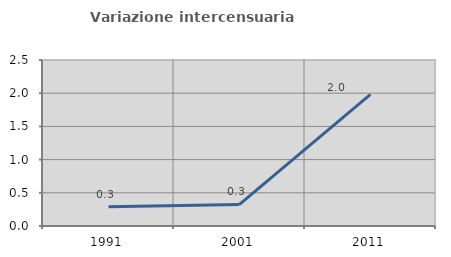
| Category | Variazione intercensuaria annua |
|---|---|
| 1991.0 | 0.29 |
| 2001.0 | 0.325 |
| 2011.0 | 1.982 |